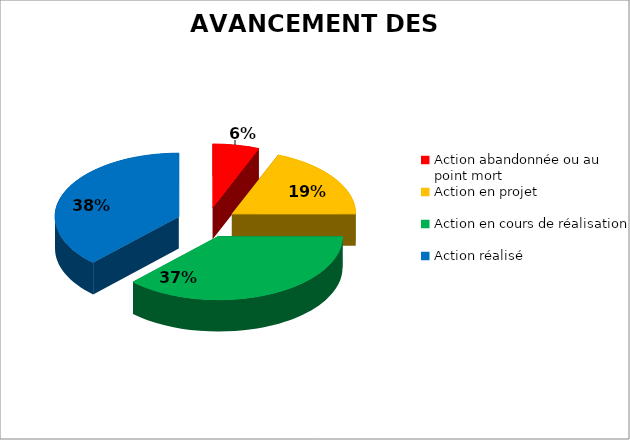
| Category | AVANCEMENT DES ACTIONS : |
|---|---|
| Action abandonnée ou au point mort | 0.061 |
| Action en projet | 0.189 |
| Action en cours de réalisation | 0.372 |
| Action réalisé | 0.378 |